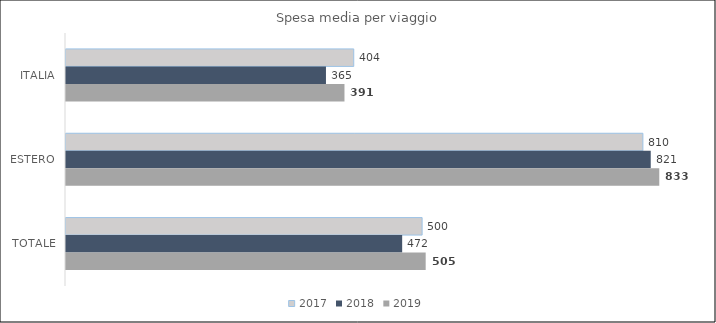
| Category | 2017 | 2018 | 2019 |
|---|---|---|---|
| ITALIA | 404 | 365 | 391 |
| ESTERO | 810 | 821 | 833 |
| TOTALE | 500 | 472 | 505 |